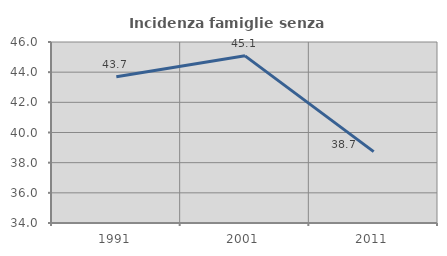
| Category | Incidenza famiglie senza nuclei |
|---|---|
| 1991.0 | 43.697 |
| 2001.0 | 45.082 |
| 2011.0 | 38.732 |